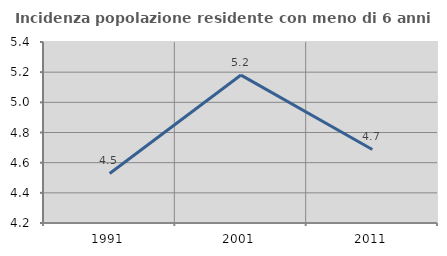
| Category | Incidenza popolazione residente con meno di 6 anni |
|---|---|
| 1991.0 | 4.528 |
| 2001.0 | 5.181 |
| 2011.0 | 4.688 |